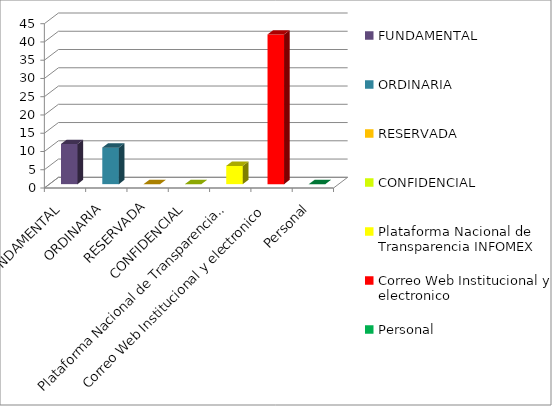
| Category | Series 2 |
|---|---|
| FUNDAMENTAL | 11 |
| ORDINARIA | 10 |
| RESERVADA | 0 |
| CONFIDENCIAL | 0 |
| Plataforma Nacional de Transparencia INFOMEX | 5 |
| Correo Web Institucional y electronico | 41 |
| Personal | 0 |